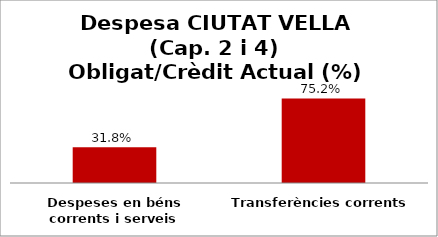
| Category | Series 0 |
|---|---|
| Despeses en béns corrents i serveis | 0.318 |
| Transferències corrents | 0.752 |